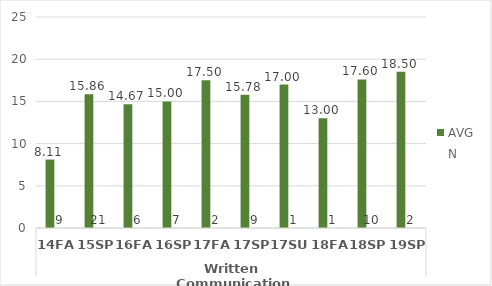
| Category | HS.AAS - AVG | HS.AAS - N |
|---|---|---|
| 0 | 8.111 | 9 |
| 1 | 15.857 | 21 |
| 2 | 14.667 | 6 |
| 3 | 15 | 7 |
| 4 | 17.5 | 2 |
| 5 | 15.778 | 9 |
| 6 | 17 | 1 |
| 7 | 13 | 1 |
| 8 | 17.6 | 10 |
| 9 | 18.5 | 2 |